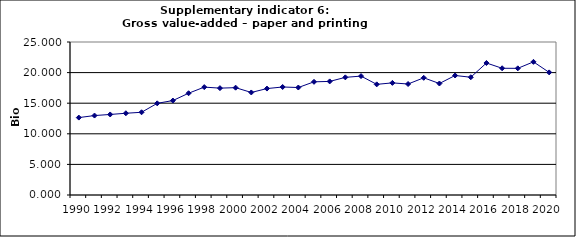
| Category | Gross value-added – paper and printing industry, Bio Euro (EC95) |
|---|---|
| 1990 | 12.648 |
| 1991 | 12.982 |
| 1992 | 13.16 |
| 1993 | 13.356 |
| 1994 | 13.518 |
| 1995 | 14.977 |
| 1996 | 15.431 |
| 1997 | 16.627 |
| 1998 | 17.628 |
| 1999 | 17.462 |
| 2000 | 17.54 |
| 2001 | 16.755 |
| 2002 | 17.39 |
| 2003 | 17.649 |
| 2004 | 17.563 |
| 2005 | 18.493 |
| 2006 | 18.56 |
| 2007 | 19.223 |
| 2008 | 19.428 |
| 2009 | 18.079 |
| 2010 | 18.321 |
| 2011 | 18.137 |
| 2012 | 19.149 |
| 2013 | 18.219 |
| 2014 | 19.528 |
| 2015 | 19.243 |
| 2016 | 21.571 |
| 2017 | 20.708 |
| 2018 | 20.696 |
| 2019 | 21.756 |
| 2020 | 20.033 |